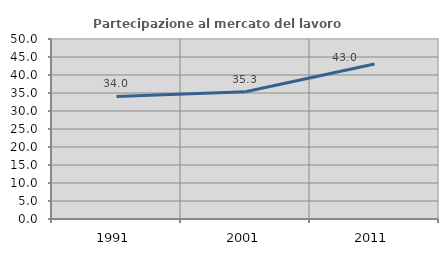
| Category | Partecipazione al mercato del lavoro  femminile |
|---|---|
| 1991.0 | 34.049 |
| 2001.0 | 35.346 |
| 2011.0 | 43.045 |